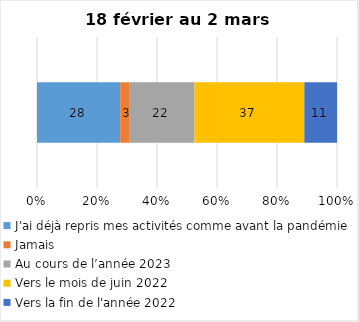
| Category | J'ai déjà repris mes activités comme avant la pandémie | Jamais | Au cours de l’année 2023 | Vers le mois de juin 2022 | Vers la fin de l'année 2022 |
|---|---|---|---|---|---|
| 0 | 28 | 3 | 22 | 37 | 11 |